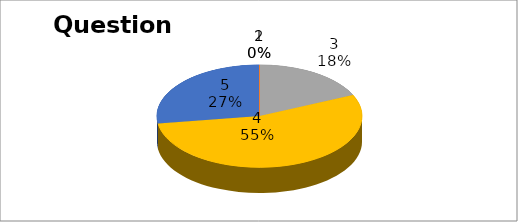
| Category | Series 0 |
|---|---|
| 0 | 0 |
| 1 | 0 |
| 2 | 4 |
| 3 | 12 |
| 4 | 6 |